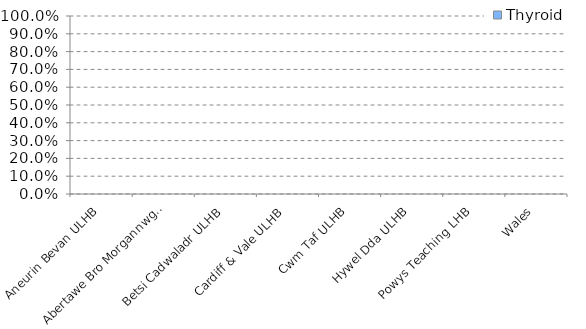
| Category | Thyroid |
|---|---|
| Aneurin Bevan ULHB | 0 |
| Abertawe Bro Morgannwg ULHB | 0 |
| Betsi Cadwaladr ULHB | 0 |
| Cardiff & Vale ULHB | 0 |
| Cwm Taf ULHB | 0 |
| Hywel Dda ULHB | 0 |
| Powys Teaching LHB | 0 |
| Wales | 0 |